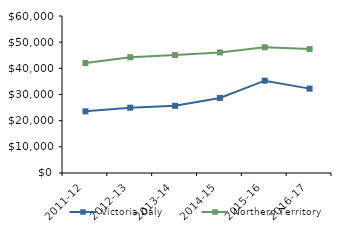
| Category | Victoria Daly | Northern Territory |
|---|---|---|
| 2011-12 | 23569 | 42021 |
| 2012-13 | 24961.17 | 44232.02 |
| 2013-14 | 25677.01 | 45075.51 |
| 2014-15 | 28697.35 | 46083.65 |
| 2015-16 | 35288 | 48046.27 |
| 2016-17 | 32243.88 | 47367.05 |